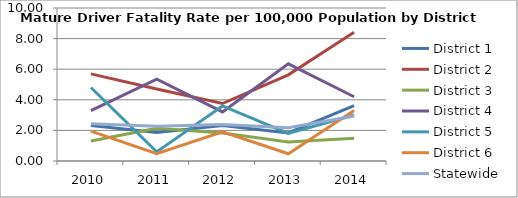
| Category | District 1 | District 2 | District 3 | District 4 | District 5 | District 6 | Statewide |
|---|---|---|---|---|---|---|---|
| 2010.0 | 2.323 | 5.692 | 1.312 | 3.29 | 4.803 | 1.956 | 2.436 |
| 2011.0 | 1.864 | 4.707 | 2.141 | 5.347 | 0.598 | 0.478 | 2.271 |
| 2012.0 | 2.321 | 3.756 | 1.83 | 3.206 | 3.598 | 1.909 | 2.381 |
| 2013.0 | 1.839 | 5.629 | 1.246 | 6.354 | 1.806 | 0.475 | 2.171 |
| 2014.0 | 3.613 | 8.409 | 1.492 | 4.2 | 3.008 | 3.298 | 2.937 |